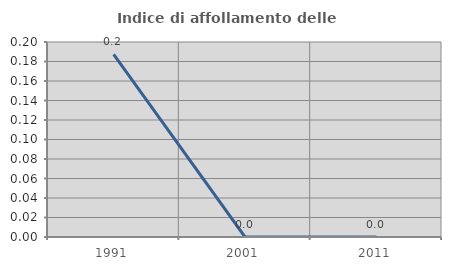
| Category | Indice di affollamento delle abitazioni  |
|---|---|
| 1991.0 | 0.187 |
| 2001.0 | 0 |
| 2011.0 | 0 |